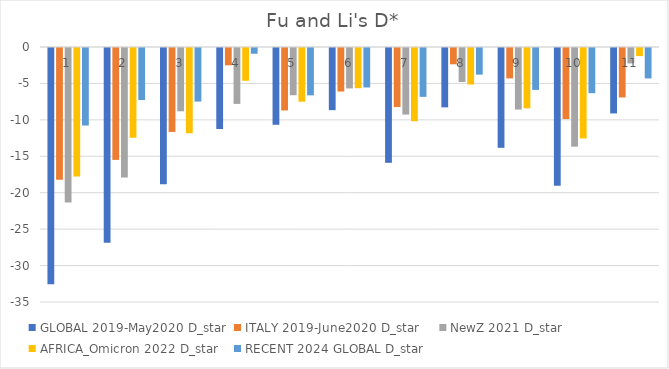
| Category | GLOBAL 2019-May2020 | ITALY 2019-June2020 | NewZ 2021 | AFRICA_Omicron 2022 | RECENT 2024 GLOBAL |
|---|---|---|---|---|---|
| 0 | -32.431 | -18.077 | -21.222 | -17.624 | -10.64 |
| 1 | -26.741 | -15.359 | -17.771 | -12.325 | -7.135 |
| 2 | -18.715 | -11.522 | -8.688 | -11.697 | -7.354 |
| 3 | -11.119 | -2.376 | -7.674 | -4.5 | -0.791 |
| 4 | -10.536 | -8.573 | -6.482 | -7.372 | -6.5 |
| 5 | -8.53 | -5.976 | -5.551 | -5.519 | -5.419 |
| 6 | -15.758 | -8.099 | -9.135 | -10.048 | -6.708 |
| 7 | -8.149 | -2.236 | -4.664 | -5.01 | -3.653 |
| 8 | -13.7 | -4.173 | -8.45 | -8.279 | -5.755 |
| 9 | -18.896 | -9.757 | -13.542 | -12.411 | -6.201 |
| 10 | -8.983 | -6.788 | -2.113 | -1.111 | -4.18 |